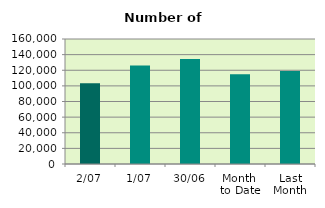
| Category | Series 0 |
|---|---|
| 2/07 | 103380 |
| 1/07 | 126136 |
| 30/06 | 134298 |
| Month 
to Date | 114758 |
| Last
Month | 119107.818 |